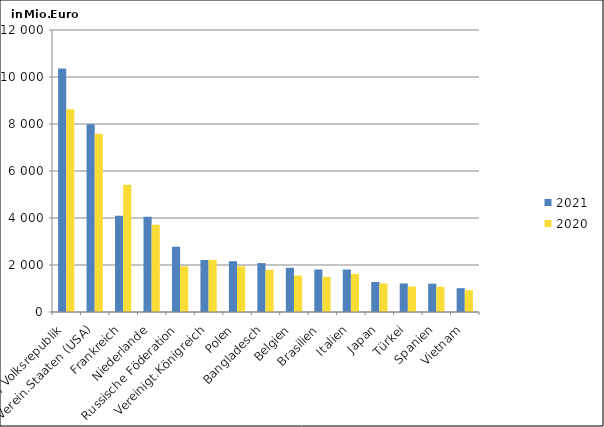
| Category | 2021 | 2020 |
|---|---|---|
| China, Volksrepublik | 10365.976 | 8625.156 |
| Verein.Staaten (USA) | 7993.459 | 7587.228 |
| Frankreich | 4093.016 | 5417.568 |
| Niederlande | 4054.593 | 3710.157 |
| Russische Föderation | 2778.946 | 1945.094 |
| Vereinigt.Königreich | 2212.897 | 2212.852 |
| Polen | 2160.123 | 1945.441 |
| Bangladesch | 2079.621 | 1796.152 |
| Belgien | 1882.245 | 1550.174 |
| Brasilien | 1809.794 | 1494.135 |
| Italien | 1809.094 | 1622.772 |
| Japan | 1277.102 | 1214.715 |
| Türkei | 1213.075 | 1081.056 |
| Spanien | 1205.798 | 1073.687 |
| Vietnam | 1013.159 | 928.255 |